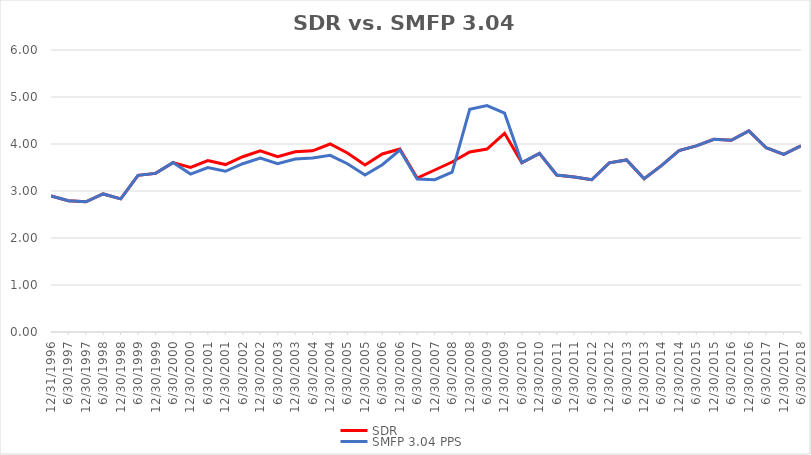
| Category | SDR | SMFP 3.04 PPS |
|---|---|---|
| 12/31/96 | 2.896 | 2.896 |
| 6/30/97 | 2.792 | 2.792 |
| 12/31/97 | 2.771 | 2.771 |
| 6/30/98 | 2.938 | 2.938 |
| 12/31/98 | 2.833 | 2.833 |
| 6/30/99 | 3.333 | 3.333 |
| 12/31/99 | 3.375 | 3.375 |
| 6/30/00 | 3.604 | 3.604 |
| 12/31/00 | 3.5 | 3.36 |
| 6/30/01 | 3.646 | 3.5 |
| 12/31/01 | 3.562 | 3.42 |
| 6/30/02 | 3.729 | 3.58 |
| 12/31/02 | 3.854 | 3.7 |
| 6/30/03 | 3.729 | 3.58 |
| 12/31/03 | 3.833 | 3.68 |
| 6/30/04 | 3.854 | 3.7 |
| 12/31/04 | 4 | 3.76 |
| 6/30/05 | 3.809 | 3.58 |
| 12/31/05 | 3.553 | 3.34 |
| 6/30/06 | 3.787 | 3.56 |
| 12/31/06 | 3.894 | 3.87 |
| 6/30/07 | 3.277 | 3.257 |
| 12/31/07 | 3.447 | 3.24 |
| 6/30/08 | 3.617 | 3.4 |
| 12/31/08 | 3.83 | 4.737 |
| 6/30/09 | 3.894 | 4.816 |
| 12/31/09 | 4.227 | 4.656 |
| 6/30/10 | 3.6 | 3.604 |
| 12/31/10 | 3.8 | 3.8 |
| 6/30/11 | 3.34 | 3.34 |
| 12/31/11 | 3.3 | 3.3 |
| 6/30/12 | 3.24 | 3.24 |
| 12/31/12 | 3.6 | 3.6 |
| 6/30/13 | 3.66 | 3.66 |
| 12/31/13 | 3.26 | 3.26 |
| 6/30/14 | 3.54 | 3.54 |
| 12/31/14 | 3.86 | 3.86 |
| 6/30/15 | 3.96 | 3.96 |
| 12/31/15 | 4.1 | 4.1 |
| 6/30/16 | 4.08 | 4.08 |
| 12/31/16 | 4.28 | 4.28 |
| 6/30/17 | 3.92 | 3.92 |
| 12/31/17 | 3.78 | 3.78 |
| 6/30/18 | 3.96 | 3.96 |